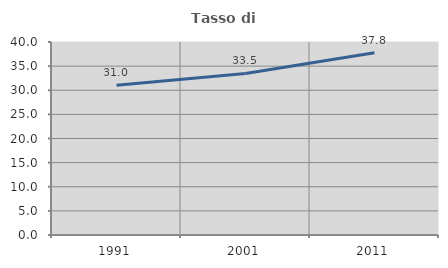
| Category | Tasso di occupazione   |
|---|---|
| 1991.0 | 31.029 |
| 2001.0 | 33.474 |
| 2011.0 | 37.771 |